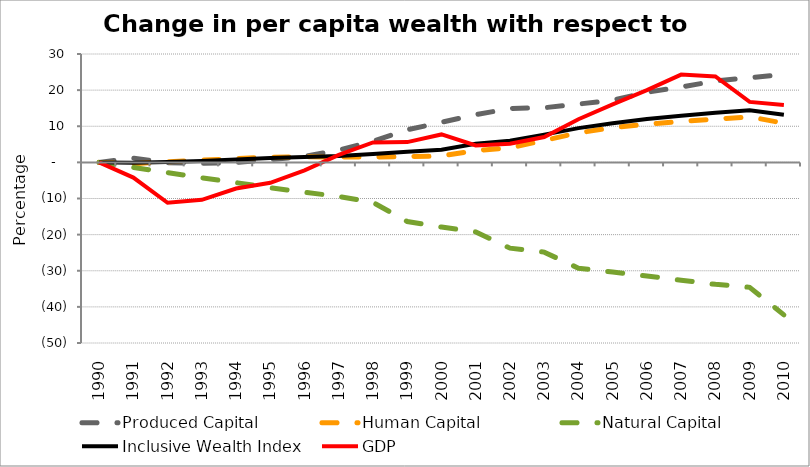
| Category | Produced Capital  | Human Capital | Natural Capital | Inclusive Wealth Index | GDP |
|---|---|---|---|---|---|
| 1990.0 | 0 | 0 | 0 | 0 | 0 |
| 1991.0 | 1.184 | -0.383 | -1.38 | -0.07 | -4.214 |
| 1992.0 | -0.115 | 0.182 | -2.832 | 0.096 | -11.187 |
| 1993.0 | -0.274 | 0.607 | -4.267 | 0.385 | -10.378 |
| 1994.0 | -0.053 | 1.046 | -5.604 | 0.765 | -7.239 |
| 1995.0 | 0.794 | 1.435 | -7.025 | 1.233 | -5.663 |
| 1996.0 | 1.646 | 1.549 | -8.264 | 1.487 | -2.195 |
| 1997.0 | 3.402 | 1.45 | -9.434 | 1.76 | 2.074 |
| 1998.0 | 5.869 | 1.507 | -11.094 | 2.297 | 5.511 |
| 1999.0 | 9.008 | 1.583 | -16.369 | 2.957 | 5.608 |
| 2000.0 | 11.104 | 1.765 | -17.915 | 3.518 | 7.733 |
| 2001.0 | 13.201 | 3.287 | -19.252 | 5.133 | 4.666 |
| 2002.0 | 14.917 | 3.994 | -23.751 | 6.004 | 5.155 |
| 2003.0 | 15.128 | 6.078 | -24.848 | 7.677 | 7.029 |
| 2004.0 | 16.141 | 8.159 | -29.298 | 9.485 | 11.934 |
| 2005.0 | 17.222 | 9.634 | -30.374 | 10.857 | 16.061 |
| 2006.0 | 19.397 | 10.566 | -31.471 | 12.028 | 19.991 |
| 2007.0 | 20.872 | 11.321 | -32.605 | 12.915 | 24.296 |
| 2008.0 | 22.534 | 11.972 | -33.763 | 13.758 | 23.791 |
| 2009.0 | 23.438 | 12.615 | -34.591 | 14.442 | 16.738 |
| 2010.0 | 24.315 | 10.835 | -42.219 | 13.159 | 15.907 |